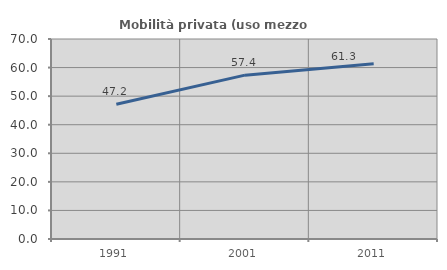
| Category | Mobilità privata (uso mezzo privato) |
|---|---|
| 1991.0 | 47.191 |
| 2001.0 | 57.353 |
| 2011.0 | 61.333 |